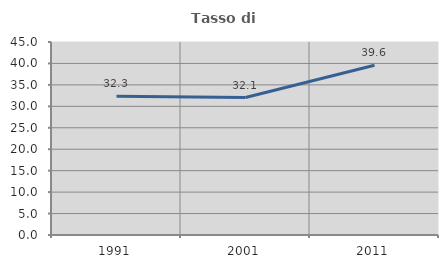
| Category | Tasso di occupazione   |
|---|---|
| 1991.0 | 32.34 |
| 2001.0 | 32.057 |
| 2011.0 | 39.572 |